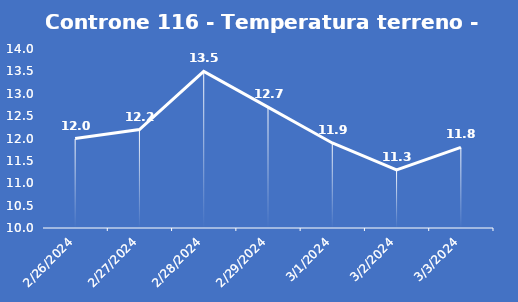
| Category | Controne 116 - Temperatura terreno - Grezzo (°C) |
|---|---|
| 2/26/24 | 12 |
| 2/27/24 | 12.2 |
| 2/28/24 | 13.5 |
| 2/29/24 | 12.7 |
| 3/1/24 | 11.9 |
| 3/2/24 | 11.3 |
| 3/3/24 | 11.8 |